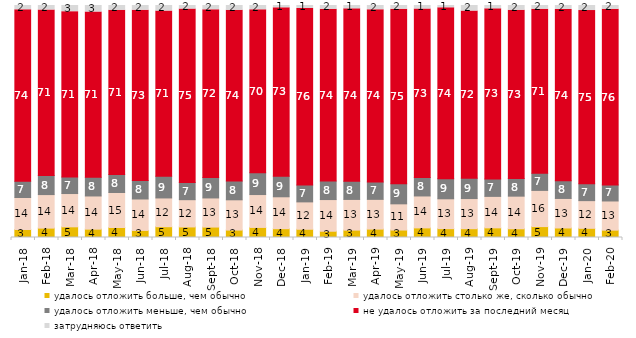
| Category | удалось отложить больше, чем обычно | удалось отложить столько же, сколько обычно | удалось отложить меньше, чем обычно | не удалось отложить за последний месяц | затрудняюсь ответить |
|---|---|---|---|---|---|
| 2018-01-01 | 3.45 | 13.8 | 7 | 73.9 | 1.85 |
| 2018-02-01 | 4.05 | 14.45 | 8.25 | 71.3 | 1.95 |
| 2018-03-01 | 4.6 | 14.35 | 7.1 | 71.3 | 2.65 |
| 2018-04-01 | 3.6 | 14.3 | 8.05 | 71.25 | 2.8 |
| 2018-05-01 | 4.3 | 15.1 | 7.75 | 70.75 | 2.1 |
| 2018-06-01 | 3.05 | 13.55 | 7.95 | 73.4 | 2.05 |
| 2018-07-01 | 4.65 | 12.4 | 9.35 | 71.2 | 2.4 |
| 2018-08-01 | 4.55 | 11.75 | 7.45 | 74.7 | 1.55 |
| 2018-09-01 | 4.5 | 12.55 | 8.8 | 72.3 | 1.85 |
| 2018-10-01 | 3.2 | 13.05 | 8.05 | 73.6 | 2.1 |
| 2018-11-01 | 4.341 | 14.172 | 9.381 | 70.259 | 1.846 |
| 2018-12-01 | 3.8 | 13.75 | 8.9 | 72.55 | 1 |
| 2019-01-01 | 3.55 | 11.8 | 7.25 | 76.1 | 1.3 |
| 2019-02-01 | 2.7 | 13.65 | 7.95 | 74.05 | 1.65 |
| 2019-03-01 | 3.182 | 13.227 | 7.857 | 74.291 | 1.442 |
| 2019-04-01 | 3.614 | 12.822 | 7.475 | 74.257 | 1.832 |
| 2019-05-01 | 3.219 | 11.293 | 8.618 | 75.285 | 1.585 |
| 2019-06-01 | 4.14 | 13.766 | 7.93 | 72.668 | 1.496 |
| 2019-07-01 | 3.812 | 12.871 | 8.663 | 73.663 | 0.99 |
| 2019-08-01 | 3.796 | 12.987 | 8.791 | 72.028 | 2.398 |
| 2019-09-01 | 4.158 | 13.564 | 7.475 | 73.366 | 1.436 |
| 2019-10-01 | 3.762 | 14.059 | 7.574 | 72.525 | 2.079 |
| 2019-11-01 | 4.703 | 15.594 | 7.376 | 70.743 | 1.584 |
| 2019-12-01 | 4.109 | 12.723 | 7.624 | 73.812 | 1.733 |
| 2020-01-01 | 3.96 | 11.931 | 7.228 | 74.703 | 2.178 |
| 2020-02-01 | 3.168 | 12.574 | 6.931 | 75.693 | 1.634 |